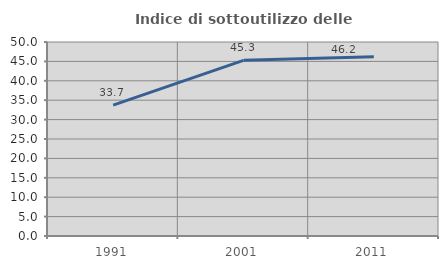
| Category | Indice di sottoutilizzo delle abitazioni  |
|---|---|
| 1991.0 | 33.721 |
| 2001.0 | 45.276 |
| 2011.0 | 46.194 |